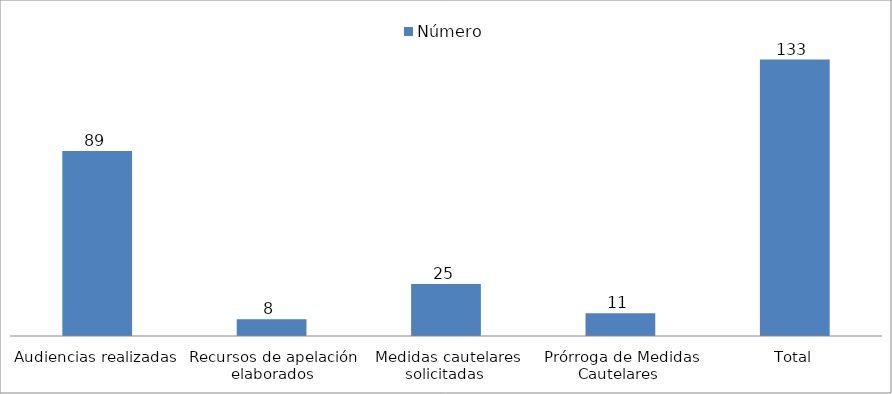
| Category | Número |
|---|---|
| Audiencias realizadas | 89 |
| Recursos de apelación elaborados | 8 |
| Medidas cautelares solicitadas  | 25 |
| Prórroga de Medidas Cautelares  | 11 |
| Total | 133 |